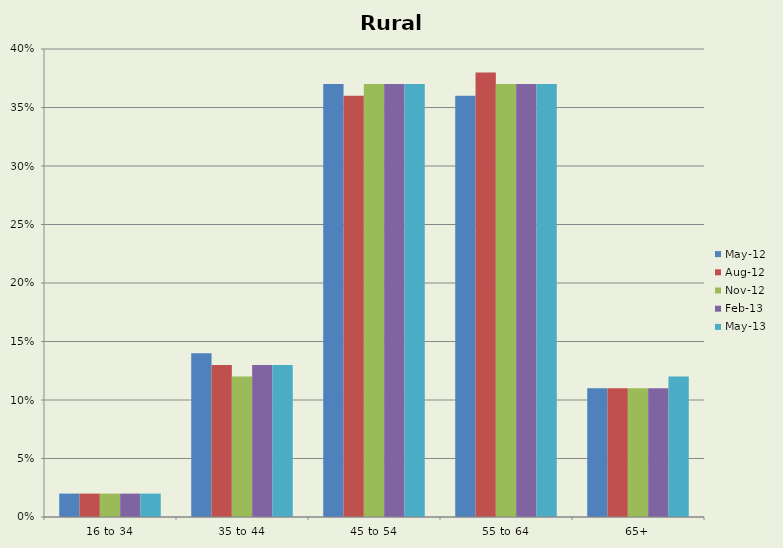
| Category | May-12 | Aug-12 | Nov-12 | Feb-13 | May-13 |
|---|---|---|---|---|---|
| 16 to 34 | 0.02 | 0.02 | 0.02 | 0.02 | 0.02 |
| 35 to 44 | 0.14 | 0.13 | 0.12 | 0.13 | 0.13 |
| 45 to 54 | 0.37 | 0.36 | 0.37 | 0.37 | 0.37 |
| 55 to 64 | 0.36 | 0.38 | 0.37 | 0.37 | 0.37 |
| 65+ | 0.11 | 0.11 | 0.11 | 0.11 | 0.12 |